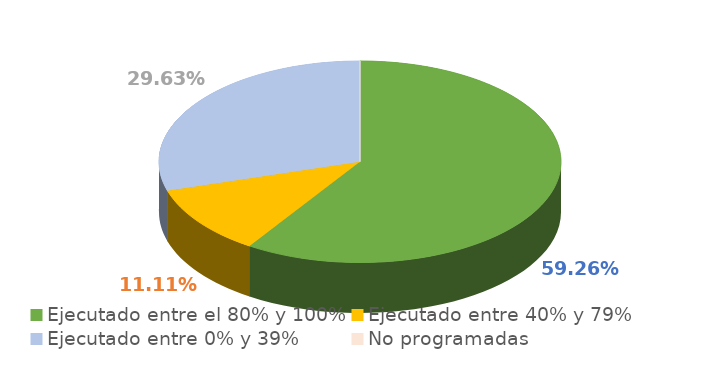
| Category | Series 0 |
|---|---|
| Ejecutado entre el 80% y 100% | 0.593 |
| Ejecutado entre 40% y 79% | 0.111 |
| Ejecutado entre 0% y 39% | 0.296 |
| No programadas | 0 |